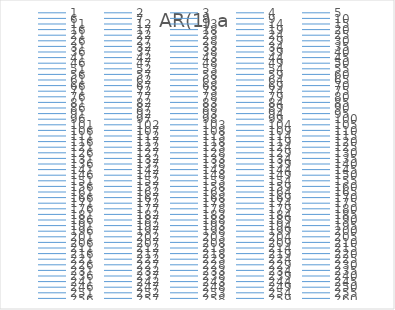
| Category | AR(1) a |
|---|---|
| 0.0 | 0 |
| 1.0 | 10.813 |
| 2.0 | 10.373 |
| 3.0 | 9.498 |
| 4.0 | 9.535 |
| 5.0 | 9.924 |
| 6.0 | 10.823 |
| 7.0 | 11.418 |
| 8.0 | 9.329 |
| 9.0 | 9.558 |
| 10.0 | 10.852 |
| 11.0 | 9.417 |
| 12.0 | 8.493 |
| 13.0 | 8.658 |
| 14.0 | 9.905 |
| 15.0 | 10.385 |
| 16.0 | 10.575 |
| 17.0 | 10.941 |
| 18.0 | 11.618 |
| 19.0 | 10.502 |
| 20.0 | 10.591 |
| 21.0 | 11.058 |
| 22.0 | 11.427 |
| 23.0 | 10.982 |
| 24.0 | 11.191 |
| 25.0 | 10.435 |
| 26.0 | 10.612 |
| 27.0 | 9.04 |
| 28.0 | 8.566 |
| 29.0 | 9.138 |
| 30.0 | 9.946 |
| 31.0 | 10.49 |
| 32.0 | 6.892 |
| 33.0 | 6.957 |
| 34.0 | 9.524 |
| 35.0 | 9.564 |
| 36.0 | 11.194 |
| 37.0 | 11.528 |
| 38.0 | 9.392 |
| 39.0 | 10.285 |
| 40.0 | 11.089 |
| 41.0 | 10.166 |
| 42.0 | 12.226 |
| 43.0 | 11.291 |
| 44.0 | 9.302 |
| 45.0 | 10.208 |
| 46.0 | 10.537 |
| 47.0 | 10.647 |
| 48.0 | 8.899 |
| 49.0 | 9.436 |
| 50.0 | 12.125 |
| 51.0 | 11.343 |
| 52.0 | 11.591 |
| 53.0 | 9.102 |
| 54.0 | 9.592 |
| 55.0 | 9.654 |
| 56.0 | 8.735 |
| 57.0 | 10.315 |
| 58.0 | 12.046 |
| 59.0 | 11.064 |
| 60.0 | 9.703 |
| 61.0 | 9.237 |
| 62.0 | 9.24 |
| 63.0 | 11.381 |
| 64.0 | 11.104 |
| 65.0 | 10.052 |
| 66.0 | 10.417 |
| 67.0 | 9.653 |
| 68.0 | 10.66 |
| 69.0 | 9.658 |
| 70.0 | 9.004 |
| 71.0 | 11.333 |
| 72.0 | 10.431 |
| 73.0 | 7.935 |
| 74.0 | 8.435 |
| 75.0 | 7.97 |
| 76.0 | 10.164 |
| 77.0 | 10.843 |
| 78.0 | 11.151 |
| 79.0 | 10.431 |
| 80.0 | 9.454 |
| 81.0 | 10.299 |
| 82.0 | 9.481 |
| 83.0 | 7.709 |
| 84.0 | 10.302 |
| 85.0 | 12.82 |
| 86.0 | 11.766 |
| 87.0 | 8.401 |
| 88.0 | 10.215 |
| 89.0 | 11.616 |
| 90.0 | 8.519 |
| 91.0 | 8.596 |
| 92.0 | 10.861 |
| 93.0 | 10.882 |
| 94.0 | 10.198 |
| 95.0 | 11.308 |
| 96.0 | 9.403 |
| 97.0 | 10.215 |
| 98.0 | 11.094 |
| 99.0 | 8.355 |
| 100.0 | 9.793 |
| 101.0 | 11.537 |
| 102.0 | 8.551 |
| 103.0 | 8.786 |
| 104.0 | 8.989 |
| 105.0 | 8.994 |
| 106.0 | 10.416 |
| 107.0 | 11.226 |
| 108.0 | 11.914 |
| 109.0 | 11.18 |
| 110.0 | 10.177 |
| 111.0 | 10.193 |
| 112.0 | 8.186 |
| 113.0 | 9.995 |
| 114.0 | 10.019 |
| 115.0 | 8.146 |
| 116.0 | 6.235 |
| 117.0 | 7.453 |
| 118.0 | 9.675 |
| 119.0 | 10.181 |
| 120.0 | 11 |
| 121.0 | 10.238 |
| 122.0 | 9.036 |
| 123.0 | 10.119 |
| 124.0 | 10.158 |
| 125.0 | 9.275 |
| 126.0 | 8.936 |
| 127.0 | 12.63 |
| 128.0 | 10.674 |
| 129.0 | 9.99 |
| 130.0 | 9.26 |
| 131.0 | 8.708 |
| 132.0 | 9.423 |
| 133.0 | 10.19 |
| 134.0 | 10.474 |
| 135.0 | 8.89 |
| 136.0 | 8.451 |
| 137.0 | 8.699 |
| 138.0 | 9.376 |
| 139.0 | 10.874 |
| 140.0 | 10.771 |
| 141.0 | 10.017 |
| 142.0 | 10.235 |
| 143.0 | 9.339 |
| 144.0 | 9.903 |
| 145.0 | 9.554 |
| 146.0 | 10.098 |
| 147.0 | 7.87 |
| 148.0 | 9.757 |
| 149.0 | 10.358 |
| 150.0 | 9.052 |
| 151.0 | 8.585 |
| 152.0 | 9.968 |
| 153.0 | 11.174 |
| 154.0 | 12.885 |
| 155.0 | 11.097 |
| 156.0 | 10.065 |
| 157.0 | 10.207 |
| 158.0 | 10.785 |
| 159.0 | 12.44 |
| 160.0 | 12.369 |
| 161.0 | 10.048 |
| 162.0 | 10.618 |
| 163.0 | 11.601 |
| 164.0 | 9.685 |
| 165.0 | 9.536 |
| 166.0 | 10.534 |
| 167.0 | 9.364 |
| 168.0 | 9.67 |
| 169.0 | 10.127 |
| 170.0 | 9.277 |
| 171.0 | 8.55 |
| 172.0 | 10 |
| 173.0 | 9.567 |
| 174.0 | 8.599 |
| 175.0 | 8.78 |
| 176.0 | 9.785 |
| 177.0 | 11.193 |
| 178.0 | 10.381 |
| 179.0 | 9.305 |
| 180.0 | 9.27 |
| 181.0 | 9.85 |
| 182.0 | 10.616 |
| 183.0 | 9.776 |
| 184.0 | 8.615 |
| 185.0 | 10.295 |
| 186.0 | 11.107 |
| 187.0 | 9.164 |
| 188.0 | 8.717 |
| 189.0 | 9.897 |
| 190.0 | 11.832 |
| 191.0 | 10.903 |
| 192.0 | 10.953 |
| 193.0 | 11.282 |
| 194.0 | 10.723 |
| 195.0 | 9.692 |
| 196.0 | 9.86 |
| 197.0 | 9.301 |
| 198.0 | 8.703 |
| 199.0 | 8.47 |
| 200.0 | 10.366 |
| 201.0 | 8.697 |
| 202.0 | 9.025 |
| 203.0 | 11.404 |
| 204.0 | 11.371 |
| 205.0 | 10.837 |
| 206.0 | 8.003 |
| 207.0 | 8.596 |
| 208.0 | 11.056 |
| 209.0 | 9.005 |
| 210.0 | 7.662 |
| 211.0 | 9.297 |
| 212.0 | 11.032 |
| 213.0 | 10.534 |
| 214.0 | 10.755 |
| 215.0 | 10.314 |
| 216.0 | 11.719 |
| 217.0 | 11.207 |
| 218.0 | 10.256 |
| 219.0 | 10.723 |
| 220.0 | 11.63 |
| 221.0 | 10.749 |
| 222.0 | 9.339 |
| 223.0 | 12.172 |
| 224.0 | 12.041 |
| 225.0 | 9.982 |
| 226.0 | 10.073 |
| 227.0 | 11.905 |
| 228.0 | 9.495 |
| 229.0 | 10.465 |
| 230.0 | 10.942 |
| 231.0 | 9.885 |
| 232.0 | 12.401 |
| 233.0 | 11.754 |
| 234.0 | 10.853 |
| 235.0 | 10.091 |
| 236.0 | 8.631 |
| 237.0 | 8.641 |
| 238.0 | 9.942 |
| 239.0 | 10.368 |
| 240.0 | 8.329 |
| 241.0 | 9.24 |
| 242.0 | 9.183 |
| 243.0 | 7.632 |
| 244.0 | 10.512 |
| 245.0 | 11.213 |
| 246.0 | 11.134 |
| 247.0 | 10.111 |
| 248.0 | 10.733 |
| 249.0 | 11.46 |
| 250.0 | 12.426 |
| 251.0 | 11.152 |
| 252.0 | 8.708 |
| 253.0 | 10.195 |
| 254.0 | 10.923 |
| 255.0 | 10.769 |
| 256.0 | 10.582 |
| 257.0 | 9.838 |
| 258.0 | 8.993 |
| 259.0 | 9.627 |
| 260.0 | 10.324 |
| 261.0 | 8.561 |
| 262.0 | 9.97 |
| 263.0 | 10.356 |
| 264.0 | 11.779 |
| 265.0 | 9.389 |
| 266.0 | 9.139 |
| 267.0 | 10.642 |
| 268.0 | 9.982 |
| 269.0 | 10.59 |
| 270.0 | 9.694 |
| 271.0 | 8.286 |
| 272.0 | 10.029 |
| 273.0 | 9.758 |
| 274.0 | 8.864 |
| 275.0 | 8.668 |
| 276.0 | 8.08 |
| 277.0 | 9.885 |
| 278.0 | 11.893 |
| 279.0 | 11.291 |
| 280.0 | 9.913 |
| 281.0 | 9.61 |
| 282.0 | 10.588 |
| 283.0 | 10.867 |
| 284.0 | 10.081 |
| 285.0 | 11.246 |
| 286.0 | 10.463 |
| 287.0 | 9.551 |
| 288.0 | 9.961 |
| 289.0 | 8.858 |
| 290.0 | 9.542 |
| 291.0 | 10.143 |
| 292.0 | 10.808 |
| 293.0 | 11.305 |
| 294.0 | 11.206 |
| 295.0 | 10.73 |
| 296.0 | 9.168 |
| 297.0 | 10.597 |
| 298.0 | 9.303 |
| 299.0 | 9.571 |
| 300.0 | 10.966 |
| 301.0 | 10.351 |
| 302.0 | 9.498 |
| 303.0 | 8.015 |
| 304.0 | 9.671 |
| 305.0 | 10.676 |
| 306.0 | 9.356 |
| 307.0 | 8.708 |
| 308.0 | 7.946 |
| 309.0 | 8.682 |
| 310.0 | 9.909 |
| 311.0 | 8.855 |
| 312.0 | 9.699 |
| 313.0 | 10.241 |
| 314.0 | 10.593 |
| 315.0 | 10.54 |
| 316.0 | 11.234 |
| 317.0 | 11.512 |
| 318.0 | 10.6 |
| 319.0 | 9.712 |
| 320.0 | 9.506 |
| 321.0 | 11.439 |
| 322.0 | 9.525 |
| 323.0 | 11.069 |
| 324.0 | 11.711 |
| 325.0 | 10.449 |
| 326.0 | 8.47 |
| 327.0 | 9.614 |
| 328.0 | 9.26 |
| 329.0 | 9.716 |
| 330.0 | 10.155 |
| 331.0 | 11.425 |
| 332.0 | 10.748 |
| 333.0 | 9.427 |
| 334.0 | 10.821 |
| 335.0 | 10.892 |
| 336.0 | 9.223 |
| 337.0 | 9.457 |
| 338.0 | 9.634 |
| 339.0 | 10.494 |
| 340.0 | 9.654 |
| 341.0 | 9.375 |
| 342.0 | 11.536 |
| 343.0 | 11.236 |
| 344.0 | 8.634 |
| 345.0 | 11.428 |
| 346.0 | 11.889 |
| 347.0 | 10.928 |
| 348.0 | 10.214 |
| 349.0 | 10.821 |
| 350.0 | 10.294 |
| 351.0 | 9.062 |
| 352.0 | 11.418 |
| 353.0 | 11.475 |
| 354.0 | 10.465 |
| 355.0 | 9.569 |
| 356.0 | 9.469 |
| 357.0 | 9.012 |
| 358.0 | 8.064 |
| 359.0 | 10.806 |
| 360.0 | 11.167 |
| 361.0 | 9.56 |
| 362.0 | 8.307 |
| 363.0 | 9.587 |
| 364.0 | 10.696 |
| 365.0 | 10.091 |
| 366.0 | 10.294 |
| 367.0 | 9.758 |
| 368.0 | 8.738 |
| 369.0 | 9.374 |
| 370.0 | 10.384 |
| 371.0 | 10.013 |
| 372.0 | 9.786 |
| 373.0 | 9.312 |
| 374.0 | 11.623 |
| 375.0 | 8.972 |
| 376.0 | 7.243 |
| 377.0 | 8.55 |
| 378.0 | 9.304 |
| 379.0 | 9.461 |
| 380.0 | 9.801 |
| 381.0 | 9.698 |
| 382.0 | 8.244 |
| 383.0 | 10.592 |
| 384.0 | 10.464 |
| 385.0 | 9.313 |
| 386.0 | 10.771 |
| 387.0 | 11.883 |
| 388.0 | 9.229 |
| 389.0 | 7.8 |
| 390.0 | 8.496 |
| 391.0 | 11.407 |
| 392.0 | 11.092 |
| 393.0 | 9.293 |
| 394.0 | 8.917 |
| 395.0 | 9.733 |
| 396.0 | 11.241 |
| 397.0 | 9.969 |
| 398.0 | 9.956 |
| 399.0 | 11.976 |
| 400.0 | 9.864 |
| 401.0 | 9.092 |
| 402.0 | 11.085 |
| 403.0 | 9.514 |
| 404.0 | 10.282 |
| 405.0 | 10.394 |
| 406.0 | 9.558 |
| 407.0 | 8.641 |
| 408.0 | 11.81 |
| 409.0 | 11.503 |
| 410.0 | 9.254 |
| 411.0 | 10.088 |
| 412.0 | 9.79 |
| 413.0 | 11.113 |
| 414.0 | 11.004 |
| 415.0 | 10.414 |
| 416.0 | 11.067 |
| 417.0 | 9.069 |
| 418.0 | 9.821 |
| 419.0 | 9.41 |
| 420.0 | 9.016 |
| 421.0 | 10.804 |
| 422.0 | 10.823 |
| 423.0 | 11.353 |
| 424.0 | 11.678 |
| 425.0 | 11.516 |
| 426.0 | 11.732 |
| 427.0 | 11.369 |
| 428.0 | 8.86 |
| 429.0 | 8.6 |
| 430.0 | 8.784 |
| 431.0 | 9.402 |
| 432.0 | 11.174 |
| 433.0 | 10.054 |
| 434.0 | 9.184 |
| 435.0 | 12.297 |
| 436.0 | 13.031 |
| 437.0 | 10.407 |
| 438.0 | 9.31 |
| 439.0 | 11.312 |
| 440.0 | 11.957 |
| 441.0 | 12.911 |
| 442.0 | 11.524 |
| 443.0 | 8.53 |
| 444.0 | 9.164 |
| 445.0 | 8.298 |
| 446.0 | 8.825 |
| 447.0 | 10.265 |
| 448.0 | 11.264 |
| 449.0 | 12.251 |
| 450.0 | 9.244 |
| 451.0 | 10.097 |
| 452.0 | 10.984 |
| 453.0 | 10.745 |
| 454.0 | 10.563 |
| 455.0 | 9.187 |
| 456.0 | 9.469 |
| 457.0 | 10.075 |
| 458.0 | 9.627 |
| 459.0 | 9.889 |
| 460.0 | 10.513 |
| 461.0 | 9.383 |
| 462.0 | 8.245 |
| 463.0 | 8.058 |
| 464.0 | 10.827 |
| 465.0 | 11.08 |
| 466.0 | 11.125 |
| 467.0 | 10.428 |
| 468.0 | 10.726 |
| 469.0 | 10.867 |
| 470.0 | 9.655 |
| 471.0 | 7.847 |
| 472.0 | 10.357 |
| 473.0 | 10.995 |
| 474.0 | 12.222 |
| 475.0 | 11.522 |
| 476.0 | 10.666 |
| 477.0 | 9.608 |
| 478.0 | 8.32 |
| 479.0 | 9.885 |
| 480.0 | 12.018 |
| 481.0 | 11.492 |
| 482.0 | 11.176 |
| 483.0 | 10.93 |
| 484.0 | 9.262 |
| 485.0 | 9.532 |
| 486.0 | 9.385 |
| 487.0 | 9.32 |
| 488.0 | 9.301 |
| 489.0 | 8.928 |
| 490.0 | 8.319 |
| 491.0 | 9.628 |
| 492.0 | 10.562 |
| 493.0 | 9.958 |
| 494.0 | 9.825 |
| 495.0 | 10.897 |
| 496.0 | 9.235 |
| 497.0 | 9.19 |
| 498.0 | 12 |
| 499.0 | 11.981 |
| 500.0 | 10.395 |
| 501.0 | 9.455 |
| 502.0 | 9.361 |
| 503.0 | 10.233 |
| 504.0 | 10.603 |
| 505.0 | 9.875 |
| 506.0 | 9.311 |
| 507.0 | 9.931 |
| 508.0 | 11.055 |
| 509.0 | 10.375 |
| 510.0 | 10.549 |
| 511.0 | 10.093 |
| 512.0 | 8.565 |
| 513.0 | 9.971 |
| 514.0 | 8.822 |
| 515.0 | 7.613 |
| 516.0 | 11.525 |
| 517.0 | 11.913 |
| 518.0 | 10.213 |
| 519.0 | 9.31 |
| 520.0 | 10.738 |
| 521.0 | 10.577 |
| 522.0 | 8.199 |
| 523.0 | 7.727 |
| 524.0 | 8.544 |
| 525.0 | 8.989 |
| 526.0 | 8.084 |
| 527.0 | 9.465 |
| 528.0 | 9.456 |
| 529.0 | 9.286 |
| 530.0 | 8.641 |
| 531.0 | 9.288 |
| 532.0 | 9.033 |
| 533.0 | 9.274 |
| 534.0 | 10.121 |
| 535.0 | 10.079 |
| 536.0 | 10.812 |
| 537.0 | 10.605 |
| 538.0 | 9.224 |
| 539.0 | 9.252 |
| 540.0 | 11.926 |
| 541.0 | 11.533 |
| 542.0 | 10.508 |
| 543.0 | 11.281 |
| 544.0 | 11.485 |
| 545.0 | 10.859 |
| 546.0 | 11.972 |
| 547.0 | 11.418 |
| 548.0 | 9.793 |
| 549.0 | 8.038 |
| 550.0 | 9.229 |
| 551.0 | 9.353 |
| 552.0 | 8.924 |
| 553.0 | 6.982 |
| 554.0 | 5.559 |
| 555.0 | 10.141 |
| 556.0 | 11.362 |
| 557.0 | 10.567 |
| 558.0 | 11.044 |
| 559.0 | 8.599 |
| 560.0 | 9.976 |
| 561.0 | 11.893 |
| 562.0 | 10.854 |
| 563.0 | 10.608 |
| 564.0 | 11.341 |
| 565.0 | 11.874 |
| 566.0 | 9.813 |
| 567.0 | 11.015 |
| 568.0 | 11.175 |
| 569.0 | 7.831 |
| 570.0 | 7.817 |
| 571.0 | 9.188 |
| 572.0 | 10.347 |
| 573.0 | 10.623 |
| 574.0 | 9.134 |
| 575.0 | 9.936 |
| 576.0 | 9.325 |
| 577.0 | 9.72 |
| 578.0 | 9.863 |
| 579.0 | 9.479 |
| 580.0 | 8.588 |
| 581.0 | 8.928 |
| 582.0 | 10.181 |
| 583.0 | 10.021 |
| 584.0 | 9.44 |
| 585.0 | 7.973 |
| 586.0 | 10.907 |
| 587.0 | 10.388 |
| 588.0 | 9.498 |
| 589.0 | 8.952 |
| 590.0 | 9.981 |
| 591.0 | 9.199 |
| 592.0 | 8.97 |
| 593.0 | 9.842 |
| 594.0 | 9.493 |
| 595.0 | 11.536 |
| 596.0 | 10.815 |
| 597.0 | 8.765 |
| 598.0 | 9.796 |
| 599.0 | 11.262 |
| 600.0 | 11.281 |